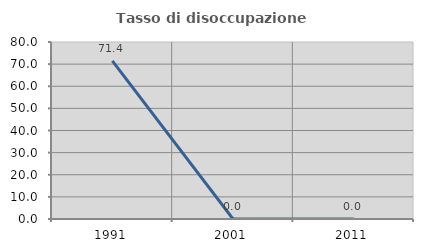
| Category | Tasso di disoccupazione giovanile  |
|---|---|
| 1991.0 | 71.429 |
| 2001.0 | 0 |
| 2011.0 | 0 |